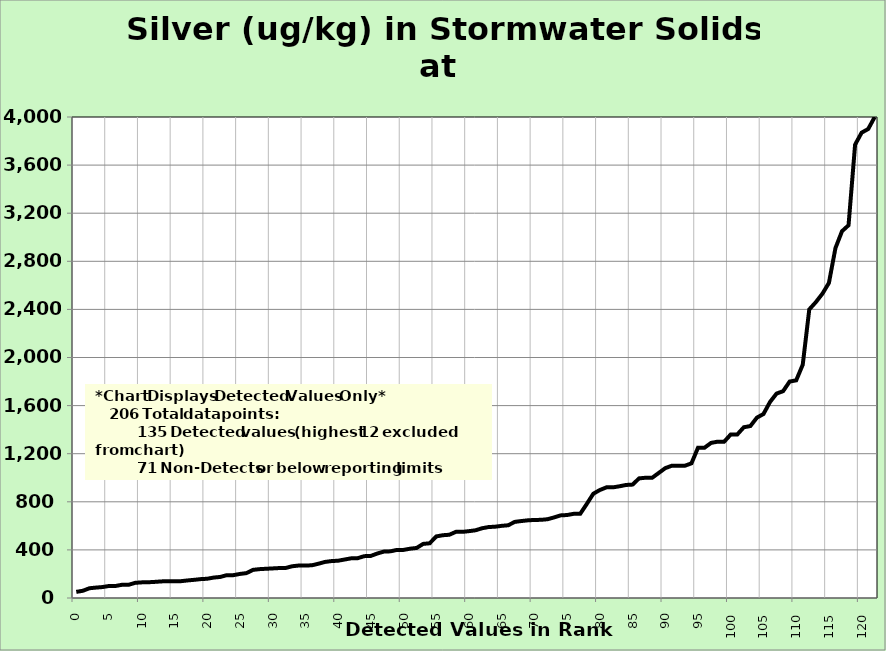
| Category | Silver |
|---|---|
| 0.0 | 51 |
| 1.0 | 60 |
| 2.0 | 81 |
| 3.0 | 86.5 |
| 4.0 | 91 |
| 5.0 | 100 |
| 6.0 | 100 |
| 7.0 | 110 |
| 8.0 | 110 |
| 9.0 | 126 |
| 10.0 | 130 |
| 11.0 | 131 |
| 12.0 | 134 |
| 13.0 | 138 |
| 14.0 | 140 |
| 15.0 | 140 |
| 16.0 | 140 |
| 17.0 | 146 |
| 18.0 | 151 |
| 19.0 | 157 |
| 20.0 | 160 |
| 21.0 | 170 |
| 22.0 | 175 |
| 23.0 | 190 |
| 24.0 | 190 |
| 25.0 | 200 |
| 26.0 | 207 |
| 27.0 | 234 |
| 28.0 | 240 |
| 29.0 | 243 |
| 30.0 | 246 |
| 31.0 | 249 |
| 32.0 | 250 |
| 33.0 | 264 |
| 34.0 | 270 |
| 35.0 | 270 |
| 36.0 | 272 |
| 37.0 | 285 |
| 38.0 | 300 |
| 39.0 | 307 |
| 40.0 | 310 |
| 41.0 | 320 |
| 42.0 | 330 |
| 43.0 | 331 |
| 44.0 | 348 |
| 45.0 | 350 |
| 46.0 | 370 |
| 47.0 | 386 |
| 48.0 | 388 |
| 49.0 | 400 |
| 50.0 | 400 |
| 51.0 | 410 |
| 52.0 | 416 |
| 53.0 | 450 |
| 54.0 | 455 |
| 55.0 | 512 |
| 56.0 | 522 |
| 57.0 | 526 |
| 58.0 | 550 |
| 59.0 | 550 |
| 60.0 | 556 |
| 61.0 | 563 |
| 62.0 | 580 |
| 63.0 | 590 |
| 64.0 | 593 |
| 65.0 | 600 |
| 66.0 | 605 |
| 67.0 | 633 |
| 68.0 | 640 |
| 69.0 | 646 |
| 70.0 | 649 |
| 71.0 | 650 |
| 72.0 | 655 |
| 73.0 | 670 |
| 74.0 | 687 |
| 75.0 | 690 |
| 76.0 | 700 |
| 77.0 | 700 |
| 78.0 | 782 |
| 79.0 | 867 |
| 80.0 | 898 |
| 81.0 | 920 |
| 82.0 | 920 |
| 83.0 | 929 |
| 84.0 | 940 |
| 85.0 | 943 |
| 86.0 | 995 |
| 87.0 | 1000 |
| 88.0 | 1000 |
| 89.0 | 1040 |
| 90.0 | 1080 |
| 91.0 | 1100 |
| 92.0 | 1100 |
| 93.0 | 1100 |
| 94.0 | 1120 |
| 95.0 | 1250 |
| 96.0 | 1250 |
| 97.0 | 1290 |
| 98.0 | 1300 |
| 99.0 | 1300 |
| 100.0 | 1360 |
| 101.0 | 1360 |
| 102.0 | 1420 |
| 103.0 | 1430 |
| 104.0 | 1500 |
| 105.0 | 1530 |
| 106.0 | 1630 |
| 107.0 | 1700 |
| 108.0 | 1720 |
| 109.0 | 1800 |
| 110.0 | 1810 |
| 111.0 | 1940 |
| 112.0 | 2400 |
| 113.0 | 2460 |
| 114.0 | 2530 |
| 115.0 | 2620 |
| 116.0 | 2910 |
| 117.0 | 3050 |
| 118.0 | 3100 |
| 119.0 | 3770 |
| 120.0 | 3870 |
| 121.0 | 3900 |
| 122.0 | 4000 |